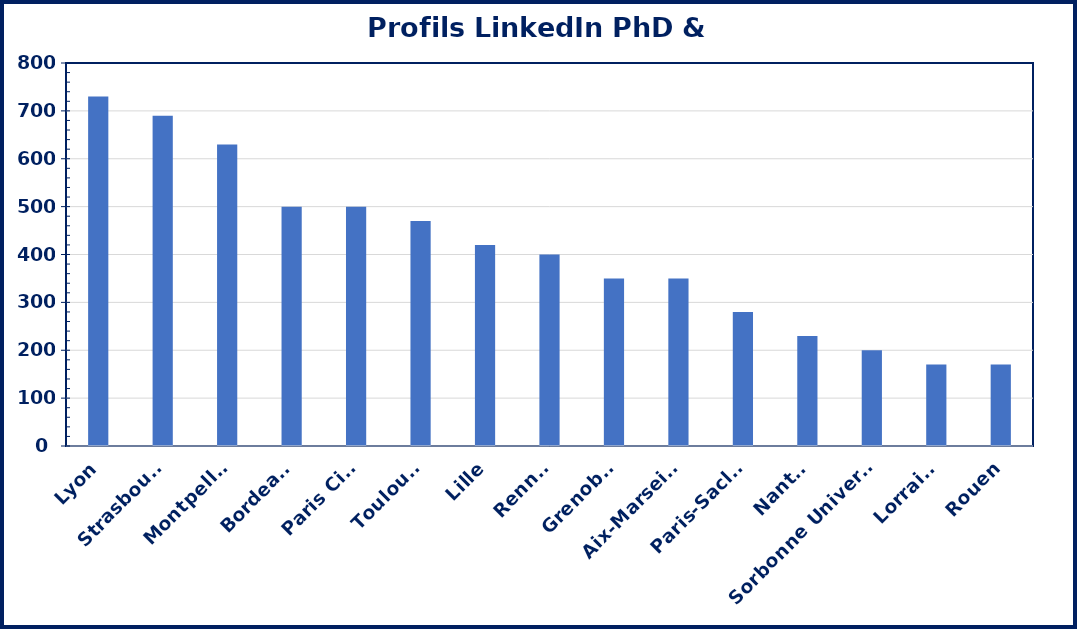
| Category | Series 0 |
|---|---|
| Lyon | 730 |
| Strasbourg | 690 |
| Montpellier | 630 |
| Bordeaux | 500 |
| Paris Cité | 500 |
| Toulouse | 470 |
| Lille | 420 |
| Rennes | 400 |
| Grenoble | 350 |
| Aix-Marseille | 350 |
| Paris-Saclay | 280 |
| Nantes | 230 |
| Sorbonne Université | 200 |
| Lorraine | 170 |
| Rouen | 170 |